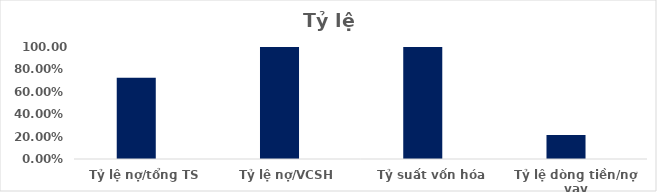
| Category | Series 0 | Series 1 | Series 2 | Series 3 | Series 4 | Series 5 | Series 6 |
|---|---|---|---|---|---|---|---|
| Tỷ lệ nợ/tổng TS | 0.725 |  |  |  |  |  |  |
| Tỷ lệ nợ/VCSH | 2.634 |  |  |  |  |  |  |
| Tỷ suất vốn hóa | 1.126 |  |  |  |  |  |  |
| Tỷ lệ dòng tiền/nợ vay | 0.214 |  |  |  |  |  |  |